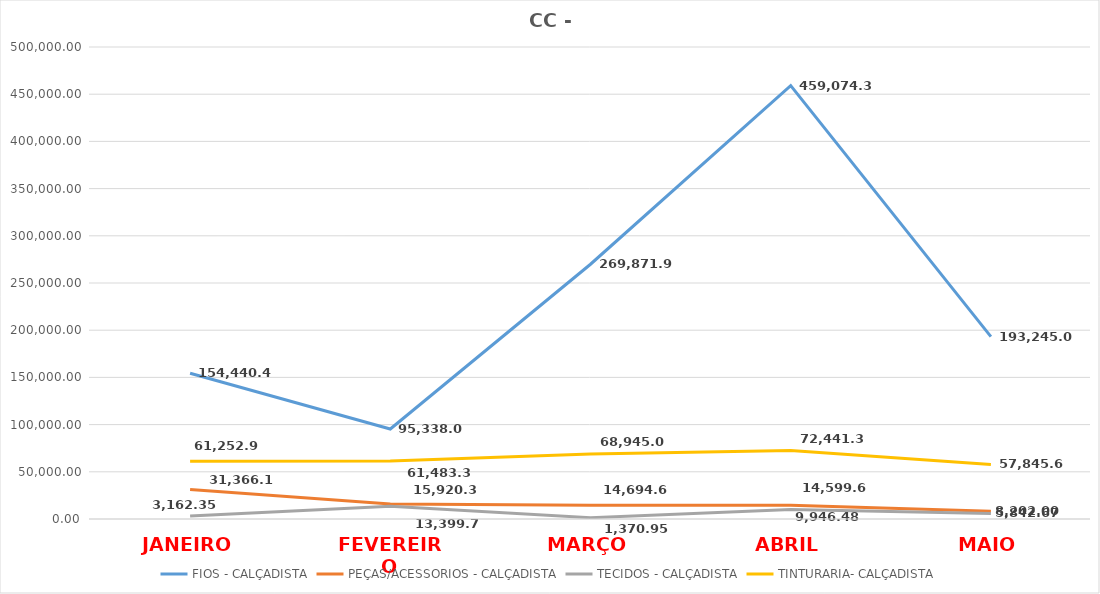
| Category | FIOS - CALÇADISTA | PEÇAS/ACESSORIOS - CALÇADISTA | TECIDOS - CALÇADISTA | TINTURARIA- CALÇADISTA |
|---|---|---|---|---|
| JANEIRO | 154440.47 | 31366.16 | 3162.35 | 61252.91 |
| FEVEREIRO | 95338.03 | 15920.35 | 13399.74 | 61483.39 |
| MARÇO | 269871.97 | 14694.64 | 1370.95 | 68945.07 |
| ABRIL | 459074.33 | 14599.65 | 9946.48 | 72441.3 |
| MAIO | 193245.07 | 8202 | 5842.67 | 57845.69 |